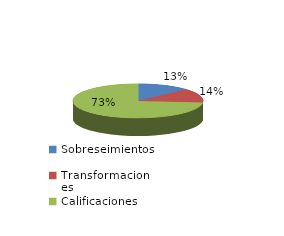
| Category | Series 0 |
|---|---|
| Sobreseimientos | 26 |
| Transformaciones | 27 |
| Calificaciones | 146 |